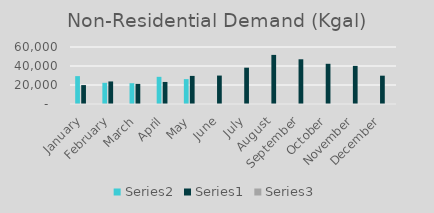
| Category | Series 1 | Series 0 | Series 2 |
|---|---|---|---|
| January | 29345 | 19908 | 1.474 |
| February | 22317.599 | 23745 | 0.94 |
| March | 21887.421 | 21154 | 1.035 |
| April | 28601.111 | 23203.745 | 1.233 |
| May | 26182.77 | 29574.268 | 0.885 |
| June | 0 | 29931.133 | 0 |
| July | 0 | 38220.373 | 0 |
| August | 0 | 51691.008 | 0 |
| September | 0 | 47078.323 | 0 |
| October | 0 | 42320.849 | 0 |
| November | 0 | 40123.835 | 0 |
| December | 0 | 29804.055 | 0 |